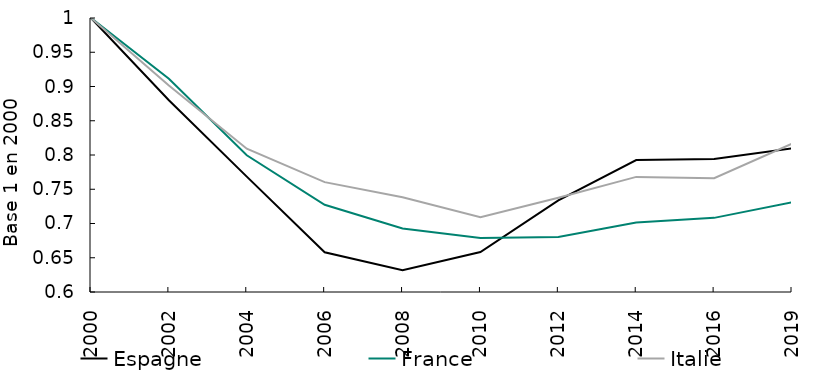
| Category | Espagne | France | Italie |
|---|---|---|---|
| 2000.0 | 1 | 1 | 1 |
| 2002.0 | 0.88 | 0.911 | 0.901 |
| 2004.0 | 0.768 | 0.8 | 0.809 |
| 2006.0 | 0.658 | 0.727 | 0.76 |
| 2008.0 | 0.632 | 0.693 | 0.738 |
| 2010.0 | 0.658 | 0.679 | 0.709 |
| 2012.0 | 0.734 | 0.68 | 0.738 |
| 2014.0 | 0.793 | 0.702 | 0.768 |
| 2016.0 | 0.794 | 0.708 | 0.766 |
| 2019.0 | 0.81 | 0.731 | 0.817 |